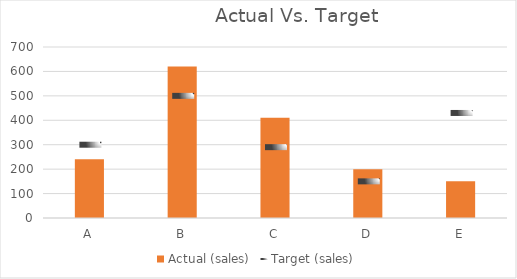
| Category | Actual (sales) |
|---|---|
| A | 240 |
| B | 620 |
| C | 410 |
| D | 200 |
| E | 150 |